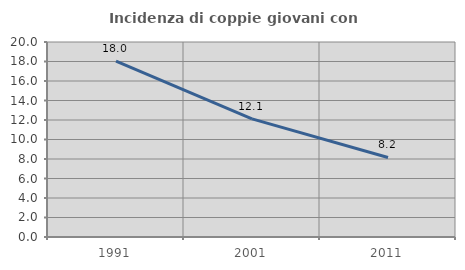
| Category | Incidenza di coppie giovani con figli |
|---|---|
| 1991.0 | 18.035 |
| 2001.0 | 12.113 |
| 2011.0 | 8.16 |